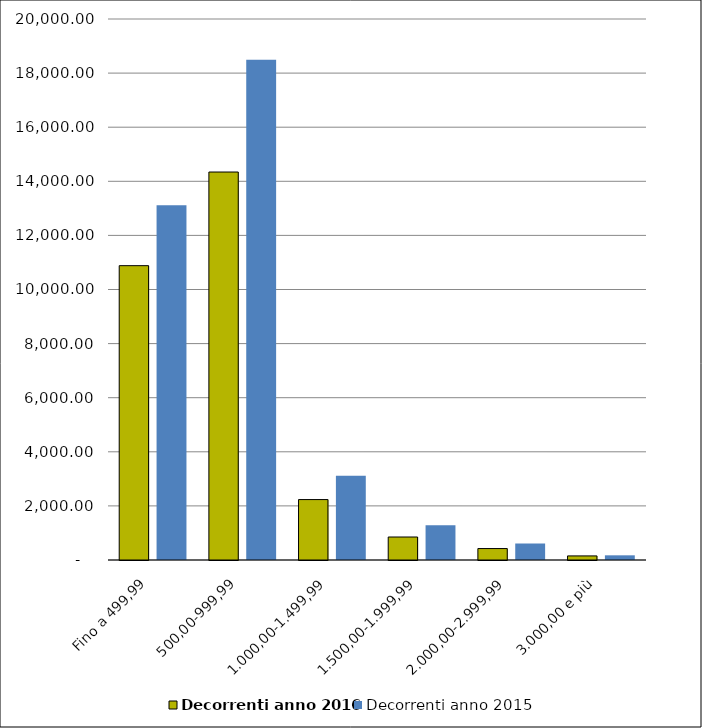
| Category | Decorrenti anno 2016 | Decorrenti anno 2015 |
|---|---|---|
| Fino a 499,99 | 10881 | 13112 |
| 500,00-999,99 | 14343 | 18496 |
| 1.000,00-1.499,99 | 2234 | 3119 |
| 1.500,00-1.999,99 | 850 | 1287 |
| 2.000,00-2.999,99 | 423 | 610 |
| 3.000,00 e più | 151 | 173 |